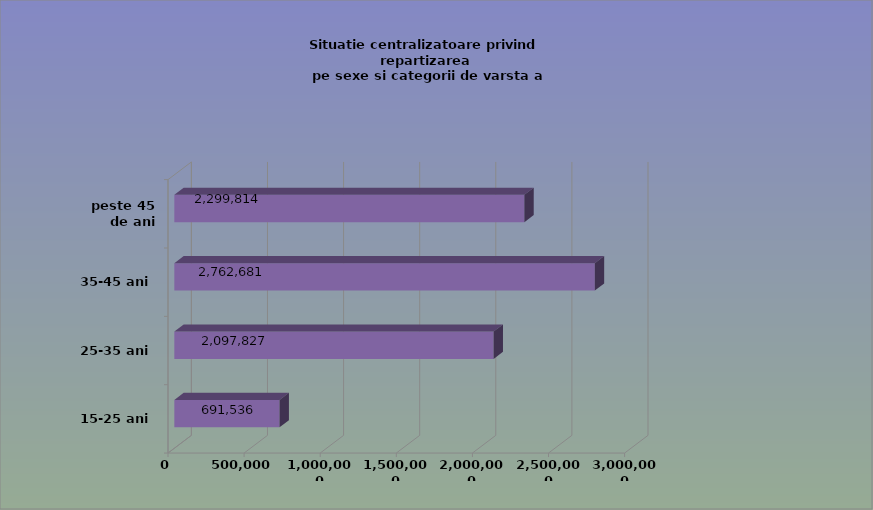
| Category | 15-25 ani 25-35 ani 35-45 ani peste 45 de ani |
|---|---|
| 15-25 ani | 691536 |
| 25-35 ani | 2097827 |
| 35-45 ani | 2762681 |
| peste 45 de ani | 2299814 |